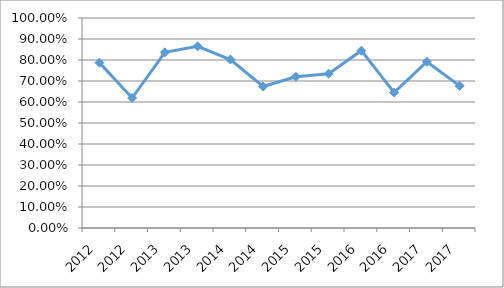
| Category | EXGR-N2O17 |
|---|---|
| 2012.0 | 0.788 |
| 2012.0 | 0.619 |
| 2013.0 | 0.836 |
| 2013.0 | 0.865 |
| 2014.0 | 0.802 |
| 2014.0 | 0.674 |
| 2015.0 | 0.72 |
| 2015.0 | 0.735 |
| 2016.0 | 0.844 |
| 2016.0 | 0.645 |
| 2017.0 | 0.792 |
| 2017.0 | 0.677 |